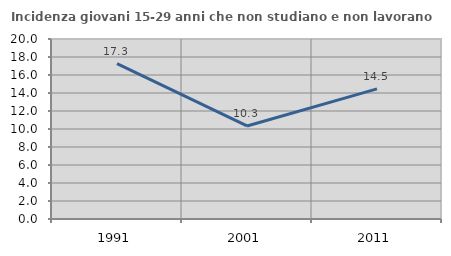
| Category | Incidenza giovani 15-29 anni che non studiano e non lavorano  |
|---|---|
| 1991.0 | 17.273 |
| 2001.0 | 10.34 |
| 2011.0 | 14.464 |